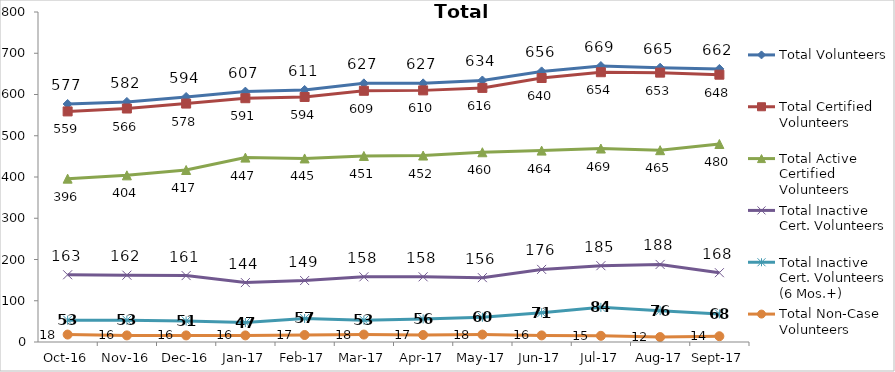
| Category | Total Volunteers | Total Certified Volunteers | Total Active Certified Volunteers | Total Inactive Cert. Volunteers | Total Inactive Cert. Volunteers (6 Mos.+) | Total Non-Case Volunteers |
|---|---|---|---|---|---|---|
| 2016-10-01 | 577 | 559 | 396 | 163 | 53 | 18 |
| 2016-11-01 | 582 | 566 | 404 | 162 | 53 | 16 |
| 2016-12-01 | 594 | 578 | 417 | 161 | 51 | 16 |
| 2017-01-01 | 607 | 591 | 447 | 144 | 47 | 16 |
| 2017-02-01 | 611 | 594 | 445 | 149 | 57 | 17 |
| 2017-03-01 | 627 | 609 | 451 | 158 | 53 | 18 |
| 2017-04-01 | 627 | 610 | 452 | 158 | 56 | 17 |
| 2017-05-01 | 634 | 616 | 460 | 156 | 60 | 18 |
| 2017-06-01 | 656 | 640 | 464 | 176 | 71 | 16 |
| 2017-07-01 | 669 | 654 | 469 | 185 | 84 | 15 |
| 2017-08-01 | 665 | 653 | 465 | 188 | 76 | 12 |
| 2017-09-01 | 662 | 648 | 480 | 168 | 68 | 14 |